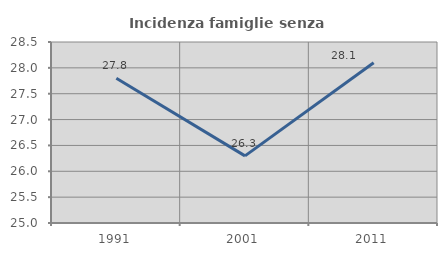
| Category | Incidenza famiglie senza nuclei |
|---|---|
| 1991.0 | 27.799 |
| 2001.0 | 26.298 |
| 2011.0 | 28.099 |